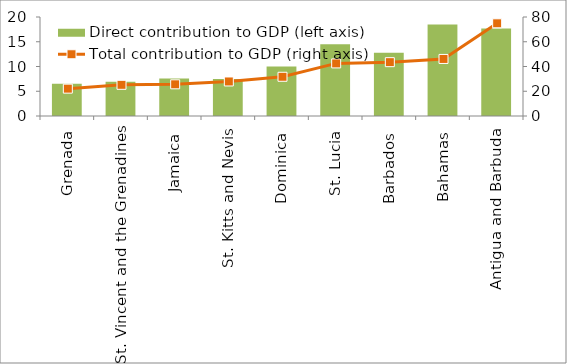
| Category | Direct contribution to GDP (left axis) |
|---|---|
| Grenada | 6.5 |
| St. Vincent and the Grenadines | 6.9 |
| Jamaica | 7.6 |
| St. Kitts and Nevis | 7.5 |
| Dominica | 10 |
| St. Lucia | 14.5 |
| Barbados | 12.8 |
| Bahamas | 18.5 |
| Antigua and Barbuda | 17.7 |